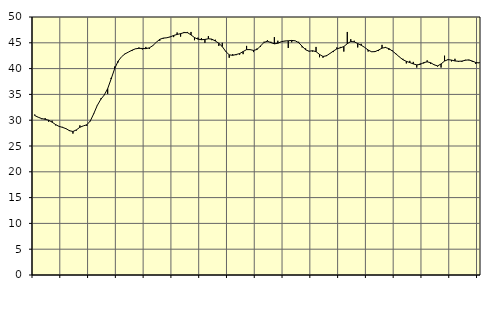
| Category | Piggar | Series 1 |
|---|---|---|
| nan | 31.1 | 30.9 |
| 87.0 | 30.6 | 30.58 |
| 87.0 | 30.2 | 30.31 |
| 87.0 | 30.4 | 30.17 |
| nan | 29.7 | 30 |
| 88.0 | 29.9 | 29.62 |
| 88.0 | 29 | 29.16 |
| 88.0 | 28.8 | 28.8 |
| nan | 28.7 | 28.61 |
| 89.0 | 28.4 | 28.36 |
| 89.0 | 28.1 | 27.97 |
| 89.0 | 27.4 | 27.81 |
| nan | 28 | 28.13 |
| 90.0 | 29 | 28.63 |
| 90.0 | 28.9 | 28.9 |
| 90.0 | 28.9 | 29.11 |
| nan | 29.8 | 29.86 |
| 91.0 | 31.2 | 31.27 |
| 91.0 | 32.8 | 32.85 |
| 91.0 | 34.2 | 34.02 |
| nan | 34.9 | 34.87 |
| 92.0 | 35.1 | 36.11 |
| 92.0 | 38.2 | 37.99 |
| 92.0 | 40.4 | 39.97 |
| nan | 41.2 | 41.43 |
| 93.0 | 42.3 | 42.3 |
| 93.0 | 42.9 | 42.85 |
| 93.0 | 43.2 | 43.21 |
| nan | 43.4 | 43.56 |
| 94.0 | 43.8 | 43.83 |
| 94.0 | 44.1 | 43.93 |
| 94.0 | 43.7 | 43.9 |
| nan | 44.2 | 43.87 |
| 95.0 | 43.8 | 44.02 |
| 95.0 | 44.5 | 44.45 |
| 95.0 | 45.1 | 45.11 |
| nan | 45.4 | 45.67 |
| 96.0 | 45.8 | 45.91 |
| 96.0 | 46 | 45.97 |
| 96.0 | 46.1 | 46.15 |
| nan | 46.1 | 46.42 |
| 97.0 | 47 | 46.62 |
| 97.0 | 46.2 | 46.77 |
| 97.0 | 47.1 | 46.98 |
| nan | 47.1 | 46.96 |
| 98.0 | 47.1 | 46.53 |
| 98.0 | 45.5 | 46.01 |
| 98.0 | 46 | 45.71 |
| nan | 45.9 | 45.6 |
| 99.0 | 45 | 45.65 |
| 99.0 | 46.3 | 45.78 |
| 99.0 | 45.5 | 45.71 |
| nan | 45.6 | 45.35 |
| 0.0 | 44.4 | 44.91 |
| 0.0 | 45 | 44.26 |
| 0.0 | 43.4 | 43.32 |
| nan | 42.1 | 42.67 |
| 1.0 | 42.8 | 42.57 |
| 1.0 | 42.6 | 42.73 |
| 1.0 | 42.7 | 42.91 |
| nan | 42.8 | 43.3 |
| 2.0 | 44.4 | 43.68 |
| 2.0 | 43.7 | 43.68 |
| 2.0 | 43.2 | 43.52 |
| nan | 43.9 | 43.71 |
| 3.0 | 44.2 | 44.37 |
| 3.0 | 45.2 | 45.07 |
| 3.0 | 45.5 | 45.3 |
| nan | 45.2 | 45.04 |
| 4.0 | 46.1 | 44.8 |
| 4.0 | 45.4 | 44.91 |
| 4.0 | 45.2 | 45.21 |
| nan | 45.3 | 45.35 |
| 5.0 | 44 | 45.39 |
| 5.0 | 45.1 | 45.46 |
| 5.0 | 45.4 | 45.39 |
| nan | 45.2 | 45.02 |
| 6.0 | 44.1 | 44.34 |
| 6.0 | 43.9 | 43.64 |
| 6.0 | 43.3 | 43.37 |
| nan | 43.3 | 43.46 |
| 7.0 | 44.2 | 43.29 |
| 7.0 | 42.2 | 42.75 |
| 7.0 | 42.1 | 42.35 |
| nan | 42.6 | 42.48 |
| 8.0 | 42.9 | 42.93 |
| 8.0 | 43.2 | 43.4 |
| 8.0 | 44.1 | 43.82 |
| nan | 44.2 | 44.03 |
| 9.0 | 43.3 | 44.27 |
| 9.0 | 47.1 | 44.83 |
| 9.0 | 45.7 | 45.25 |
| nan | 45.4 | 45.18 |
| 10.0 | 44.1 | 44.86 |
| 10.0 | 44.8 | 44.53 |
| 10.0 | 44.1 | 44.11 |
| nan | 43.3 | 43.6 |
| 11.0 | 43.3 | 43.26 |
| 11.0 | 43.4 | 43.29 |
| 11.0 | 43.4 | 43.59 |
| nan | 44.6 | 43.97 |
| 12.0 | 44.2 | 44.09 |
| 12.0 | 43.6 | 43.86 |
| 12.0 | 43.5 | 43.4 |
| nan | 42.8 | 42.86 |
| 13.0 | 42.3 | 42.26 |
| 13.0 | 41.9 | 41.73 |
| 13.0 | 41 | 41.41 |
| nan | 41.5 | 41.17 |
| 14.0 | 41.3 | 40.91 |
| 14.0 | 40.2 | 40.72 |
| 14.0 | 41 | 40.82 |
| nan | 41 | 41.16 |
| 15.0 | 41.6 | 41.31 |
| 15.0 | 40.9 | 41.14 |
| 15.0 | 40.8 | 40.74 |
| nan | 40.4 | 40.52 |
| 16.0 | 40.2 | 40.9 |
| 16.0 | 42.5 | 41.46 |
| 16.0 | 41.8 | 41.74 |
| nan | 41.4 | 41.65 |
| 17.0 | 41.9 | 41.48 |
| 17.0 | 41.3 | 41.42 |
| 17.0 | 41.3 | 41.45 |
| nan | 41.7 | 41.62 |
| 18.0 | 41.6 | 41.69 |
| 18.0 | 41.3 | 41.46 |
| 18.0 | 40.9 | 41.18 |
| nan | 41.2 | 41.09 |